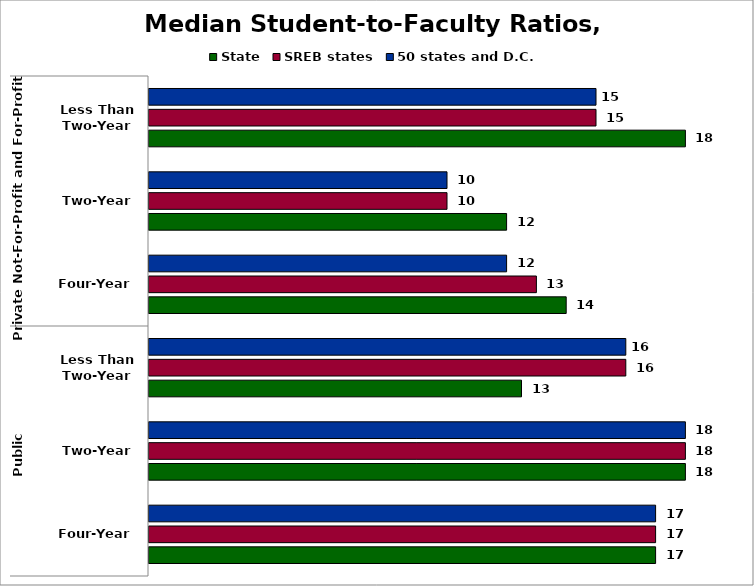
| Category | State | SREB states | 50 states and D.C. |
|---|---|---|---|
| 0 | 17 | 17 | 17 |
| 1 | 18 | 18 | 18 |
| 2 | 12.5 | 16 | 16 |
| 3 | 14 | 13 | 12 |
| 4 | 12 | 10 | 10 |
| 5 | 18 | 15 | 15 |